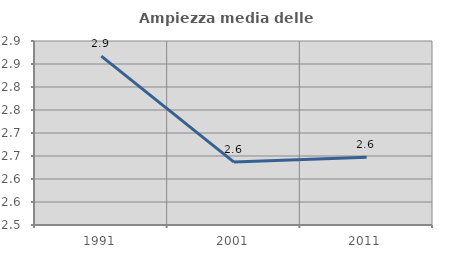
| Category | Ampiezza media delle famiglie |
|---|---|
| 1991.0 | 2.867 |
| 2001.0 | 2.637 |
| 2011.0 | 2.647 |